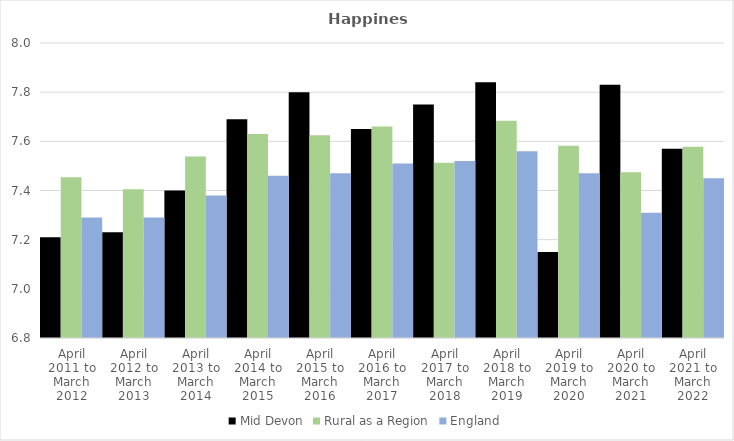
| Category | Mid Devon | Rural as a Region | England |
|---|---|---|---|
| April 2011 to March 2012 | 7.21 | 7.454 | 7.29 |
| April 2012 to March 2013 | 7.23 | 7.406 | 7.29 |
| April 2013 to March 2014 | 7.4 | 7.539 | 7.38 |
| April 2014 to March 2015 | 7.69 | 7.63 | 7.46 |
| April 2015 to March 2016 | 7.8 | 7.625 | 7.47 |
| April 2016 to March 2017 | 7.65 | 7.661 | 7.51 |
| April 2017 to March 2018 | 7.75 | 7.513 | 7.52 |
| April 2018 to March 2019 | 7.84 | 7.684 | 7.56 |
| April 2019 to March 2020 | 7.15 | 7.582 | 7.47 |
| April 2020 to March 2021 | 7.83 | 7.474 | 7.31 |
| April 2021 to March 2022 | 7.57 | 7.577 | 7.45 |